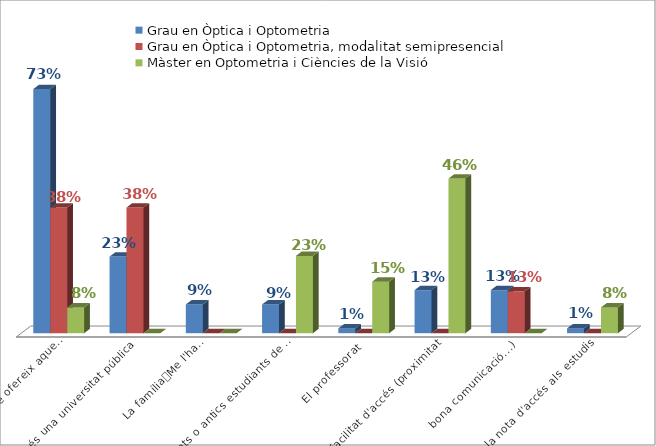
| Category | Grau en Òptica i Optometria | Grau en Òptica i Optometria, modalitat semipresencial | Màster en Optometria i Ciències de la Visió |
|---|---|---|---|
| 0 | 0.729 | 0.375 | 0.077 |
| 1 | 0.229 | 0.375 | 0 |
| 2 | 0.086 | 0 | 0 |
| 3 | 0.086 | 0 | 0.231 |
| 4 | 0.014 | 0 | 0.154 |
| 5 | 0.129 | 0 | 0.462 |
| 6 | 0.129 | 0.125 | 0 |
| 7 | 0.014 | 0 | 0.077 |